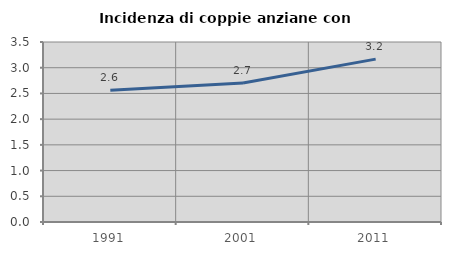
| Category | Incidenza di coppie anziane con figli |
|---|---|
| 1991.0 | 2.564 |
| 2001.0 | 2.703 |
| 2011.0 | 3.167 |